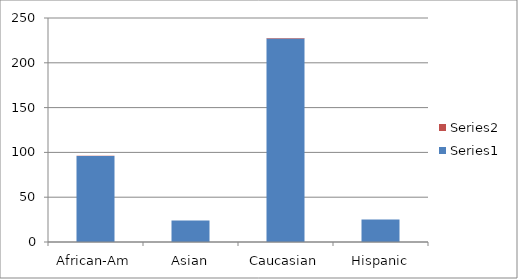
| Category | Series 0 | Series 1 |
|---|---|---|
| African-Am | 96 | 0.258 |
| Asian | 24 | 0.064 |
| Caucasian | 227 | 0.61 |
| Hispanic | 25 | 0.067 |